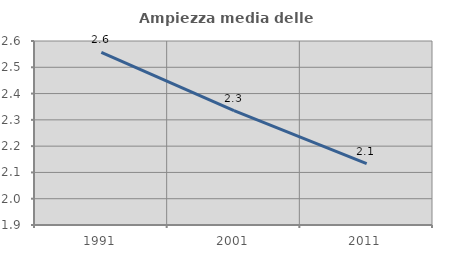
| Category | Ampiezza media delle famiglie |
|---|---|
| 1991.0 | 2.557 |
| 2001.0 | 2.335 |
| 2011.0 | 2.133 |